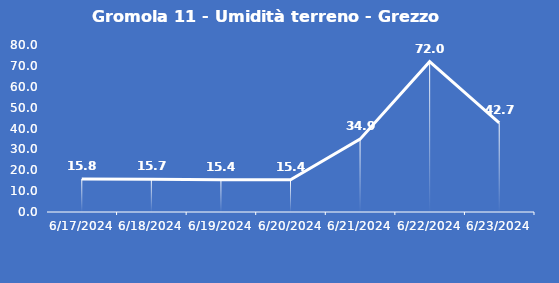
| Category | Gromola 11 - Umidità terreno - Grezzo (%VWC) |
|---|---|
| 6/17/24 | 15.8 |
| 6/18/24 | 15.7 |
| 6/19/24 | 15.4 |
| 6/20/24 | 15.4 |
| 6/21/24 | 34.9 |
| 6/22/24 | 72 |
| 6/23/24 | 42.7 |